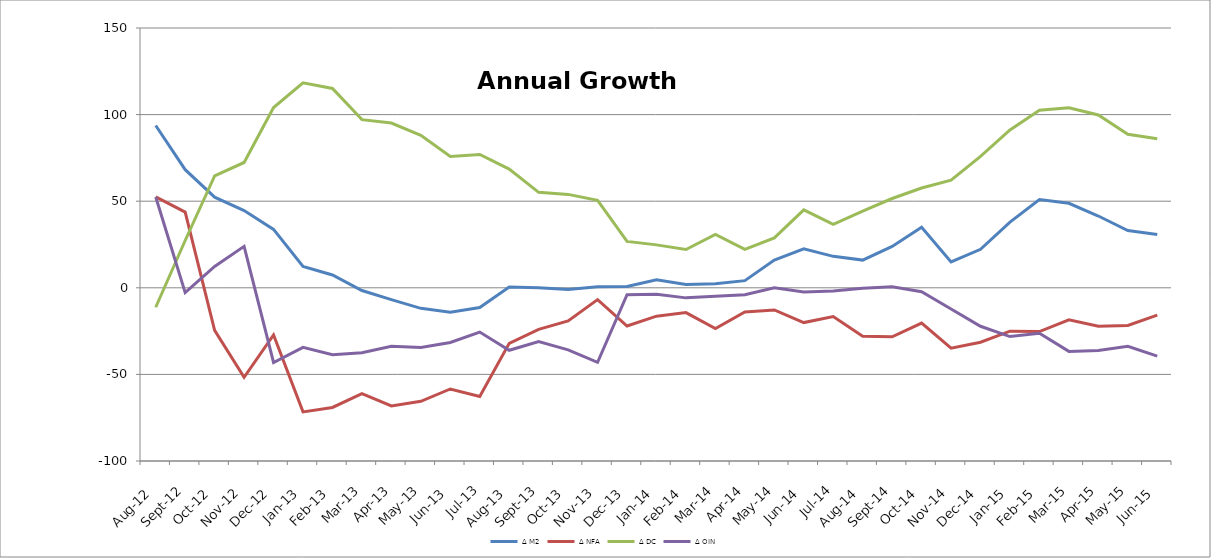
| Category | ∆ M2 | ∆ NFA | ∆ DC | ∆ OIN |
|---|---|---|---|---|
| 2012-08-06 | 93.691 | 52.528 | -11.233 | 52.397 |
| 2012-09-07 | 68.189 | 43.704 | 27.306 | -2.822 |
| 2012-10-07 | 52.319 | -24.566 | 64.581 | 12.304 |
| 2012-11-08 | 44.615 | -51.668 | 72.352 | 23.932 |
| 2012-12-09 | 33.729 | -27.26 | 104.112 | -43.123 |
| 2013-01-31 | 12.389 | -71.631 | 118.386 | -34.365 |
| 2013-02-01 | 7.39 | -69.076 | 115.092 | -38.625 |
| 2013-03-02 | -1.55 | -61.162 | 97.101 | -37.488 |
| 2013-04-30 | -6.845 | -68.235 | 95.151 | -33.761 |
| 2013-05-01 | -11.865 | -65.529 | 88.061 | -34.396 |
| 2013-06-02 | -14.103 | -58.406 | 75.874 | -31.571 |
| 2013-07-31 | -11.365 | -62.776 | 76.972 | -25.562 |
| 2013-08-01 | 0.429 | -32.049 | 68.562 | -36.084 |
| 2013-09-02 | 0.036 | -24.01 | 55.116 | -31.07 |
| 2013-10-03 | -1.043 | -19.114 | 53.935 | -35.864 |
| 2013-11-04 | 0.651 | -6.804 | 50.502 | -43.047 |
| 2013-12-05 | 0.755 | -22.054 | 26.809 | -4 |
| 2014-01-14 | 4.602 | -16.398 | 24.79 | -3.79 |
| 2014-02-14 | 1.946 | -14.316 | 22.077 | -5.814 |
| 2014-03-15 | 2.398 | -23.479 | 30.804 | -4.928 |
| 2014-04-16 | 4.135 | -13.953 | 22.142 | -4.054 |
| 2014-05-17 | 15.997 | -12.808 | 28.813 | -0.009 |
| 2014-06-18 | 22.498 | -20.084 | 45.002 | -2.419 |
| 2014-07-19 | 18.166 | -16.63 | 36.596 | -1.801 |
| 2014-08-20 | 15.989 | -27.926 | 44.224 | -0.309 |
| 2014-09-21 | 23.871 | -28.281 | 51.549 | 0.604 |
| 2014-10-22 | 34.977 | -20.345 | 57.602 | -2.28 |
| 2014-11-23 | 14.949 | -34.896 | 62.104 | -12.259 |
| 2014-12-24 | 22.228 | -31.409 | 75.858 | -22.22 |
| 2015-01-25 | 37.926 | -25.043 | 91.142 | -28.173 |
| 2015-02-26 | 50.983 | -25.297 | 102.545 | -26.265 |
| 2015-03-27 | 48.776 | -18.495 | 103.986 | -36.714 |
| 2015-04-28 | 41.44 | -22.171 | 99.812 | -36.2 |
| 2015-05-29 | 33.098 | -21.747 | 88.663 | -33.818 |
| 2015-06-30 | 30.81 | -15.824 | 86.104 | -39.469 |